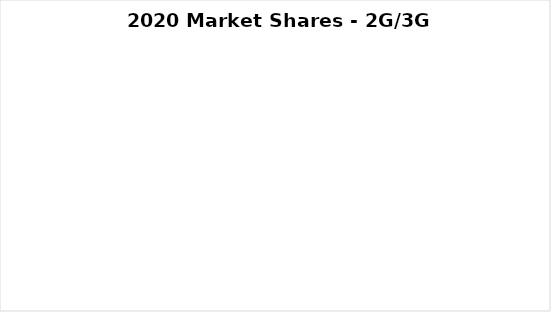
| Category | 2020 |
|---|---|
| Ericsson | 0 |
| Fujitsu | 0 |
| HPE | 0 |
| Huawei | 0 |
| Nokia | 0 |
| Samsung | 0 |
| ZTE | 0 |
| Other | 0 |